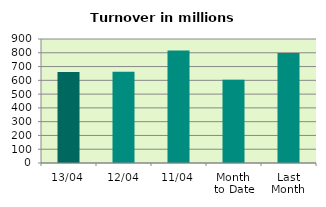
| Category | Series 0 |
|---|---|
| 13/04 | 660.456 |
| 12/04 | 662.207 |
| 11/04 | 815.956 |
| Month 
to Date | 604.007 |
| Last
Month | 798.115 |